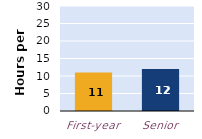
| Category | hours per week |
|---|---|
| First-year | 11 |
| Senior | 12 |